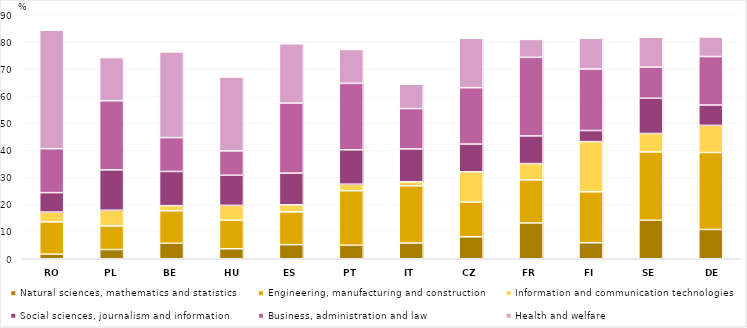
| Category | Natural sciences, mathematics and statistics | Engineering, manufacturing and construction | Information and communication technologies | Social sciences, journalism and information | Business, administration and law | Health and welfare |
|---|---|---|---|---|---|---|
| RO | 1.7 | 11.9 | 3.6 | 7.2 | 16.2 | 43.7 |
| PL | 3.4 | 8.7 | 5.8 | 14.9 | 25.5 | 15.9 |
| BE | 5.7 | 12 | 1.9 | 12.6 | 12.5 | 31.6 |
| HU | 3.7 | 10.5 | 5.5 | 11.1 | 9 | 27.2 |
| ES | 5.2 | 12.1 | 2.6 | 11.7 | 25.8 | 21.9 |
| PT | 5 | 20.1 | 2.4 | 12.7 | 24.5 | 12.5 |
| IT | 5.8 | 21.1 | 1.5 | 12.1 | 14.9 | 9 |
| CZ | 8.1 | 12.8 | 11.2 | 10.2 | 20.8 | 18.2 |
| FR | 13.2 | 15.9 | 6 | 10.2 | 29 | 6.6 |
| FI | 5.9 | 18.8 | 18.5 | 4.1 | 22.7 | 11.4 |
| SE | 14.2 | 25.2 | 6.8 | 13 | 11.5 | 11 |
| DE | 10.8 | 28.4 | 10 | 7.5 | 17.9 | 7.2 |